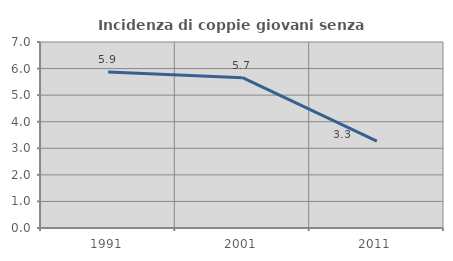
| Category | Incidenza di coppie giovani senza figli |
|---|---|
| 1991.0 | 5.87 |
| 2001.0 | 5.659 |
| 2011.0 | 3.269 |